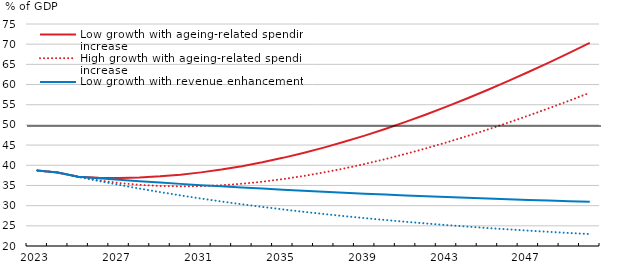
| Category | Low growth with ageing-related spending increase | High growth with ageing-related spending increase | Low growth with revenue enhancement | High growth with revenue enhancement |
|---|---|---|---|---|
| 2023.0 | 38.707 | 38.707 | 38.707 | 38.707 |
| 2024.0 | 38.219 | 38.219 | 38.219 | 38.219 |
| 2025.0 | 37.134 | 37.134 | 37.134 | 37.134 |
| 2026.0 | 36.919 | 36.269 | 36.759 | 36.109 |
| 2027.0 | 36.872 | 35.61 | 36.397 | 35.139 |
| 2028.0 | 36.986 | 35.148 | 36.049 | 34.222 |
| 2029.0 | 37.256 | 34.871 | 35.714 | 33.356 |
| 2030.0 | 37.676 | 34.769 | 35.391 | 32.536 |
| 2031.0 | 38.241 | 34.832 | 35.081 | 31.762 |
| 2032.0 | 38.944 | 35.052 | 34.781 | 31.029 |
| 2033.0 | 39.782 | 35.42 | 34.493 | 30.337 |
| 2034.0 | 40.749 | 35.928 | 34.216 | 29.682 |
| 2035.0 | 41.839 | 36.569 | 33.948 | 29.063 |
| 2036.0 | 43.05 | 37.334 | 33.691 | 28.478 |
| 2037.0 | 44.375 | 38.218 | 33.443 | 27.924 |
| 2038.0 | 45.812 | 39.213 | 33.205 | 27.401 |
| 2039.0 | 47.355 | 40.314 | 32.975 | 26.907 |
| 2040.0 | 49.001 | 41.515 | 32.754 | 26.439 |
| 2041.0 | 50.746 | 42.811 | 32.54 | 25.997 |
| 2042.0 | 52.587 | 44.196 | 32.335 | 25.579 |
| 2043.0 | 54.519 | 45.665 | 32.138 | 25.184 |
| 2044.0 | 56.54 | 47.214 | 31.947 | 24.81 |
| 2045.0 | 58.646 | 48.839 | 31.764 | 24.457 |
| 2046.0 | 60.834 | 50.535 | 31.588 | 24.123 |
| 2047.0 | 63.101 | 52.298 | 31.418 | 23.807 |
| 2048.0 | 65.444 | 54.126 | 31.254 | 23.508 |
| 2049.0 | 67.86 | 56.013 | 31.097 | 23.226 |
| 2050.0 | 70.347 | 57.958 | 30.945 | 22.959 |